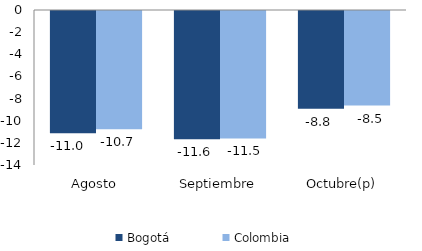
| Category | Bogotá | Colombia |
|---|---|---|
| Agosto | -11.032 | -10.676 |
| Septiembre | -11.584 | -11.515 |
| Octubre(p) | -8.831 | -8.544 |